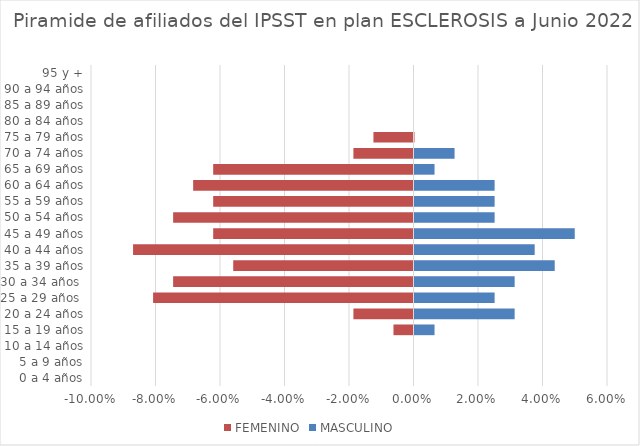
| Category | FEMENINO | MASCULINO |
|---|---|---|
| 0 a 4 años | 0 | 0 |
| 5 a 9 años | 0 | 0 |
| 10 a 14 años | 0 | 0 |
| 15 a 19 años | -0.006 | 0.006 |
| 20 a 24 años | -0.019 | 0.031 |
| 25 a 29 años  | -0.081 | 0.025 |
| 30 a 34 años  | -0.075 | 0.031 |
| 35 a 39 años | -0.056 | 0.043 |
| 40 a 44 años | -0.087 | 0.037 |
| 45 a 49 años | -0.062 | 0.05 |
| 50 a 54 años | -0.075 | 0.025 |
| 55 a 59 años | -0.062 | 0.025 |
| 60 a 64 años | -0.068 | 0.025 |
| 65 a 69 años | -0.062 | 0.006 |
| 70 a 74 años | -0.019 | 0.012 |
| 75 a 79 años | -0.012 | 0 |
| 80 a 84 años | 0 | 0 |
| 85 a 89 años | 0 | 0 |
| 90 a 94 años | 0 | 0 |
| 95 y + | 0 | 0 |